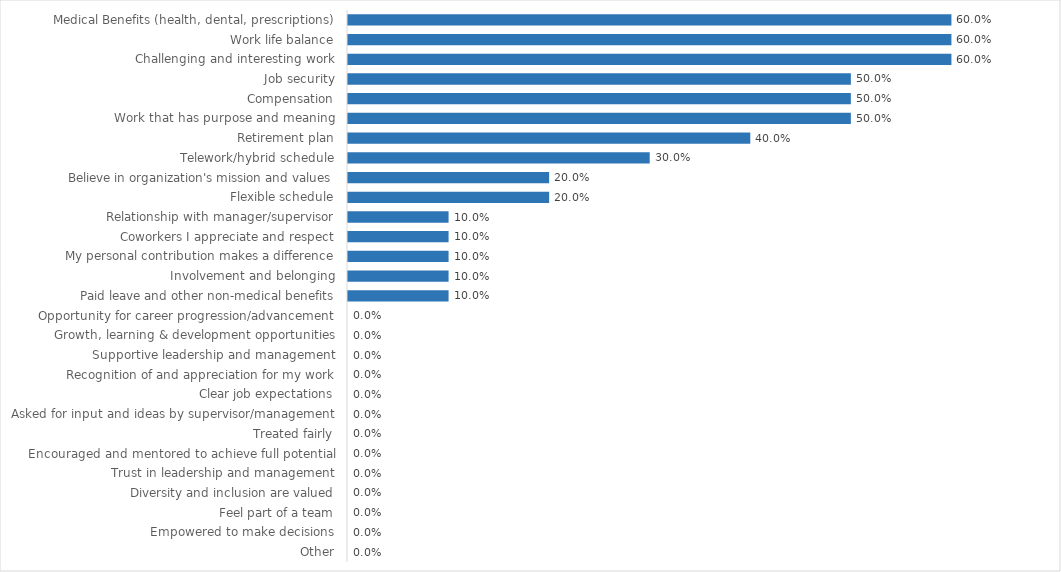
| Category | Series 0 |
|---|---|
| Medical Benefits (health, dental, prescriptions) | 0.6 |
| Work life balance | 0.6 |
| Challenging and interesting work | 0.6 |
| Job security | 0.5 |
| Compensation | 0.5 |
| Work that has purpose and meaning | 0.5 |
| Retirement plan | 0.4 |
| Telework/hybrid schedule | 0.3 |
| Believe in organization's mission and values | 0.2 |
| Flexible schedule | 0.2 |
| Relationship with manager/supervisor | 0.1 |
| Coworkers I appreciate and respect | 0.1 |
| My personal contribution makes a difference | 0.1 |
| Involvement and belonging | 0.1 |
| Paid leave and other non-medical benefits | 0.1 |
| Opportunity for career progression/advancement | 0 |
| Growth, learning & development opportunities | 0 |
| Supportive leadership and management | 0 |
| Recognition of and appreciation for my work | 0 |
| Clear job expectations | 0 |
| Asked for input and ideas by supervisor/management | 0 |
| Treated fairly | 0 |
| Encouraged and mentored to achieve full potential | 0 |
| Trust in leadership and management | 0 |
| Diversity and inclusion are valued | 0 |
| Feel part of a team | 0 |
| Empowered to make decisions | 0 |
| Other | 0 |